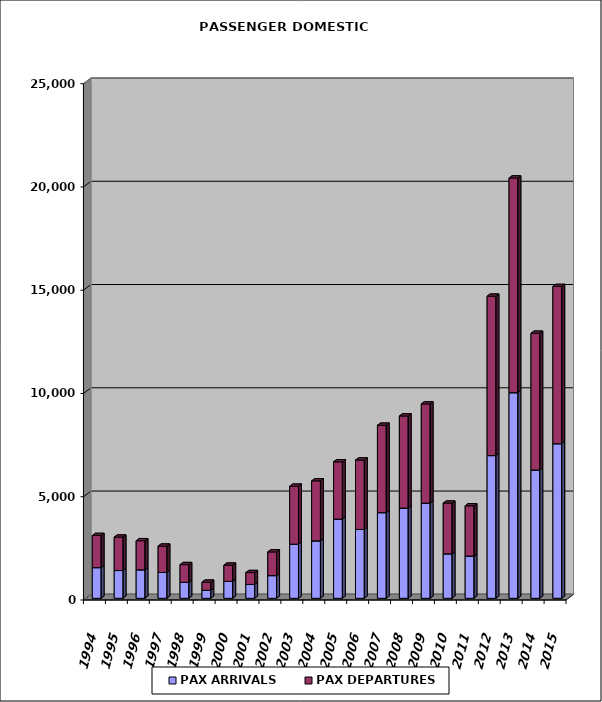
| Category | PAX ARRIVALS | PAX DEPARTURES |
|---|---|---|
| 1994.0 | 1485 | 1555 |
| 1995.0 | 1344 | 1619 |
| 1996.0 | 1380 | 1407 |
| 1997.0 | 1250 | 1276 |
| 1998.0 | 773 | 858 |
| 1999.0 | 391 | 387 |
| 2000.0 | 822 | 782 |
| 2001.0 | 671 | 574 |
| 2002.0 | 1098 | 1149 |
| 2003.0 | 2621 | 2804 |
| 2004.0 | 2780 | 2904 |
| 2005.0 | 3835 | 2773 |
| 2006.0 | 3334 | 3359 |
| 2007.0 | 4147 | 4232 |
| 2008.0 | 4368 | 4460 |
| 2009.0 | 4611 | 4799 |
| 2010.0 | 2154 | 2455 |
| 2011.0 | 2045 | 2435 |
| 2012.0 | 6910 | 7717 |
| 2013.0 | 9955 | 10394 |
| 2014.0 | 6211 | 6620 |
| 2015.0 | 7485 | 7612 |